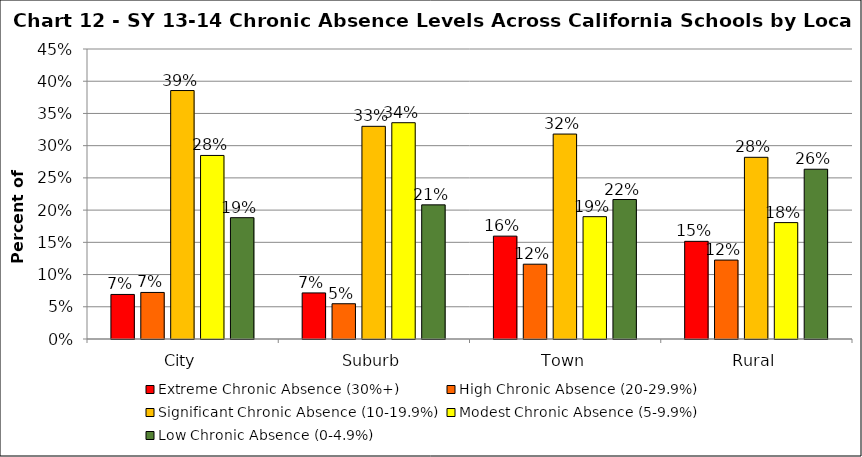
| Category | Extreme Chronic Absence (30%+) | High Chronic Absence (20-29.9%) | Significant Chronic Absence (10-19.9%) | Modest Chronic Absence (5-9.9%) | Low Chronic Absence (0-4.9%) |
|---|---|---|---|---|---|
| 0 | 0.069 | 0.072 | 0.386 | 0.285 | 0.188 |
| 1 | 0.072 | 0.055 | 0.33 | 0.336 | 0.208 |
| 2 | 0.16 | 0.116 | 0.318 | 0.19 | 0.216 |
| 3 | 0.152 | 0.122 | 0.282 | 0.181 | 0.263 |